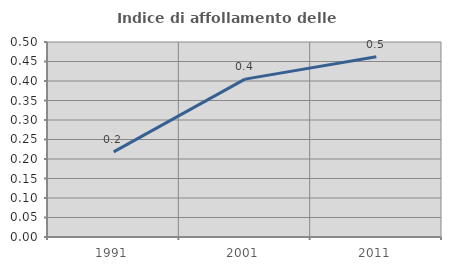
| Category | Indice di affollamento delle abitazioni  |
|---|---|
| 1991.0 | 0.218 |
| 2001.0 | 0.405 |
| 2011.0 | 0.462 |